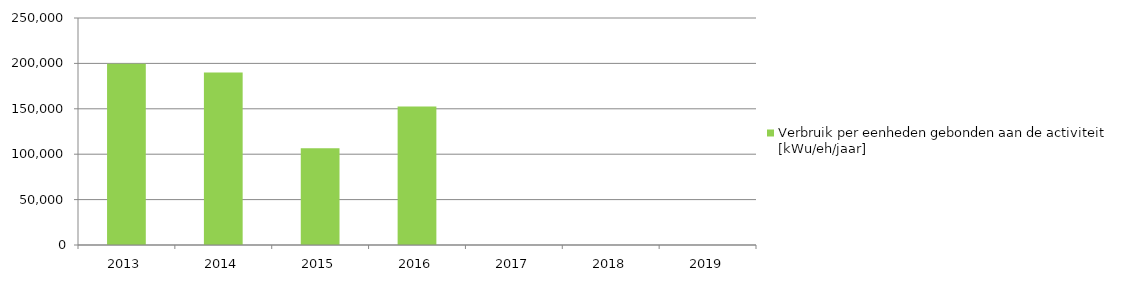
| Category | Verbruik per eenheden gebonden aan de activiteit [kWu/eh/jaar]

 |
|---|---|
| 2013.0 | 199711.877 |
| 2014.0 | 190112.095 |
| 2015.0 | 106689.186 |
| 2016.0 | 152407.014 |
| 2017.0 | 0 |
| 2018.0 | 0 |
| 2019.0 | 0 |